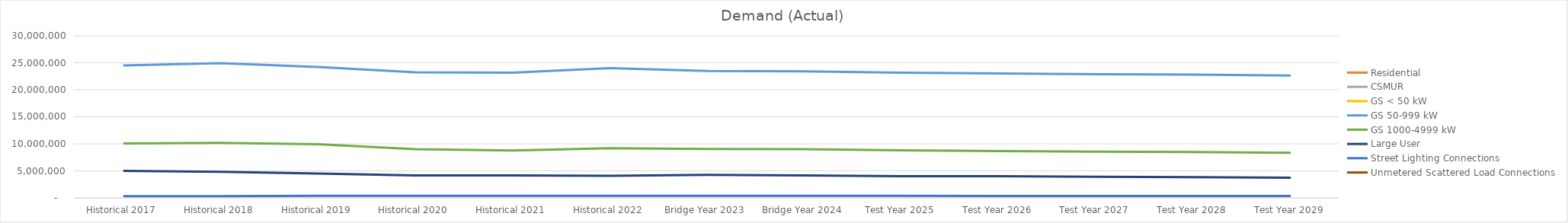
| Category | Residential | CSMUR | GS < 50 kW | GS 50-999 kW | GS 1000-4999 kW | Large User | Street Lighting Connections | Unmetered Scattered Load Connections |
|---|---|---|---|---|---|---|---|---|
| Historical 2017 |  |  |  | 24491102.345 | 10072182.441 | 4994367.551 | 325116.216 |  |
| Historical 2018 |  |  |  | 24928946.079 | 10190742.051 | 4806458.495 | 326193.686 |  |
| Historical 2019 |  |  |  | 24237414.802 | 9916370.564 | 4520863.183 | 374967.734 |  |
| Historical 2020 |  |  |  | 23233958.248 | 9018552.463 | 4158577.012 | 387653.976 |  |
| Historical 2021 |  |  |  | 23184662.403 | 8783997.722 | 4145399.434 | 394838.479 |  |
| Historical 2022 |  |  |  | 24017508.019 | 9205271.91 | 4101923.468 | 389418.611 |  |
| Bridge Year 2023 |  |  |  | 23501553.634 | 9050611.43 | 4262794.282 | 384378.514 |  |
| Bridge Year 2024 |  |  |  | 23427873.122 | 9020206.276 | 4167604.068 | 378202.38 |  |
| Test Year 2025 |  |  |  | 23180330.511 | 8819038.546 | 4013117.672 | 372026.247 |  |
| Test Year 2026 |  |  |  | 23028698.453 | 8665147.421 | 4003679.047 | 365850.114 |  |
| Test Year 2027 |  |  |  | 22887009.639 | 8546462.892 | 3905665.626 | 359673.98 |  |
| Test Year 2028 |  |  |  | 22826314.43 | 8496272.778 | 3831040.818 | 353497.847 |  |
| Test Year 2029 |  |  |  | 22647301.645 | 8354365.592 | 3744405.216 | 347321.714 |  |